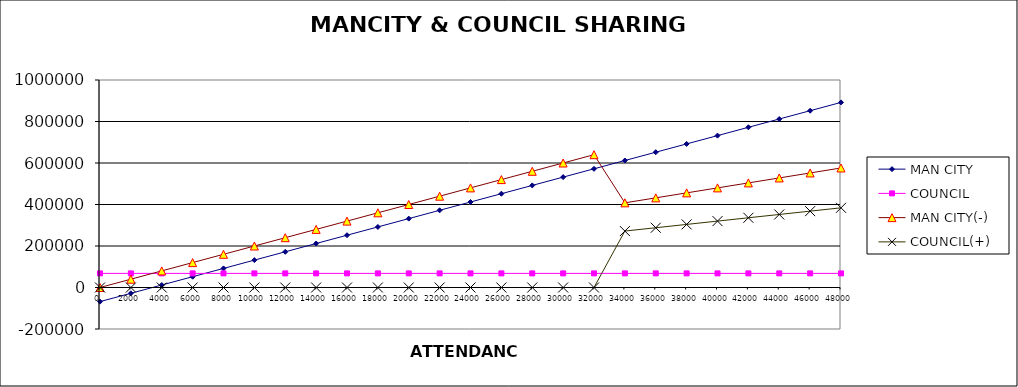
| Category | MAN CITY | COUNCIL | MAN CITY(-) | COUNCIL(+) |
|---|---|---|---|---|
| 0.0 | -68000 | 68000 | 0 | 0 |
| 2000.0 | -28000 | 68000 | 40000 | 0 |
| 4000.0 | 12000 | 68000 | 80000 | 0 |
| 6000.0 | 52000 | 68000 | 120000 | 0 |
| 8000.0 | 92000 | 68000 | 160000 | 0 |
| 10000.0 | 132000 | 68000 | 200000 | 0 |
| 12000.0 | 172000 | 68000 | 240000 | 0 |
| 14000.0 | 212000 | 68000 | 280000 | 0 |
| 16000.0 | 252000 | 68000 | 320000 | 0 |
| 18000.0 | 292000 | 68000 | 360000 | 0 |
| 20000.0 | 332000 | 68000 | 400000 | 0 |
| 22000.0 | 372000 | 68000 | 440000 | 0 |
| 24000.0 | 412000 | 68000 | 480000 | 0 |
| 26000.0 | 452000 | 68000 | 520000 | 0 |
| 28000.0 | 492000 | 68000 | 560000 | 0 |
| 30000.0 | 532000 | 68000 | 600000 | 0 |
| 32000.0 | 572000 | 68000 | 640000 | 0 |
| 34000.0 | 612000 | 68000 | 408000 | 272000 |
| 36000.0 | 652000 | 68000 | 432000 | 288000 |
| 38000.0 | 692000 | 68000 | 456000 | 304000 |
| 40000.0 | 732000 | 68000 | 480000 | 320000 |
| 42000.0 | 772000 | 68000 | 504000 | 336000 |
| 44000.0 | 812000 | 68000 | 528000 | 352000 |
| 46000.0 | 852000 | 68000 | 552000 | 368000 |
| 48000.0 | 892000 | 68000 | 576000 | 384000 |